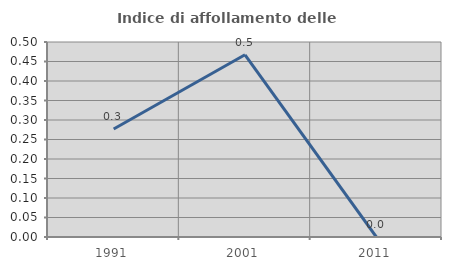
| Category | Indice di affollamento delle abitazioni  |
|---|---|
| 1991.0 | 0.277 |
| 2001.0 | 0.467 |
| 2011.0 | 0 |